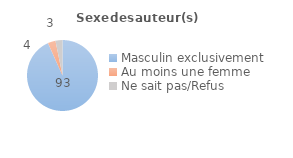
| Category | Series 0 |
|---|---|
| Masculin exclusivement | 93.29 |
| Au moins une femme | 3.53 |
| Ne sait pas/Refus | 3.18 |